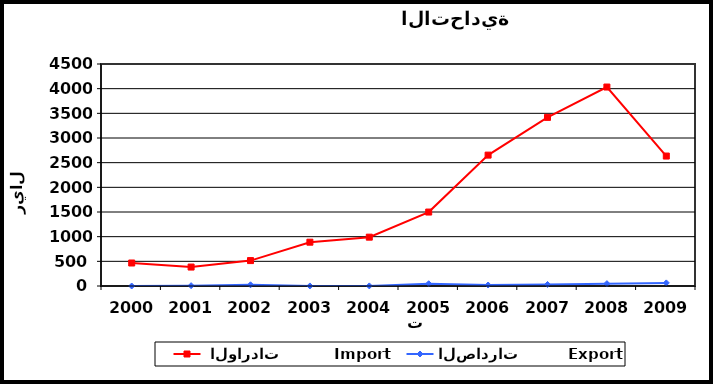
| Category |  الواردات           Import | الصادرات          Export |
|---|---|---|
| 2000.0 | 466 | 0 |
| 2001.0 | 384 | 7 |
| 2002.0 | 515 | 25 |
| 2003.0 | 888 | 1 |
| 2004.0 | 990 | 2 |
| 2005.0 | 1499 | 46 |
| 2006.0 | 2653 | 20 |
| 2007.0 | 3418 | 31 |
| 2008.0 | 4033 | 48 |
| 2009.0 | 2634 | 63 |